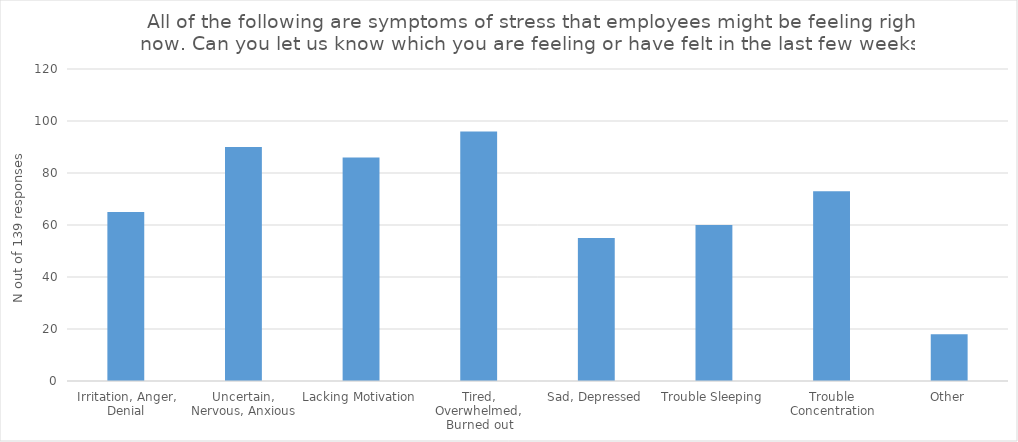
| Category | All Responses |
|---|---|
| Irritation, Anger, Denial | 65 |
| Uncertain, Nervous, Anxious | 90 |
| Lacking Motivation | 86 |
| Tired, Overwhelmed, Burned out | 96 |
| Sad, Depressed | 55 |
| Trouble Sleeping | 60 |
| Trouble Concentration | 73 |
| Other | 18 |